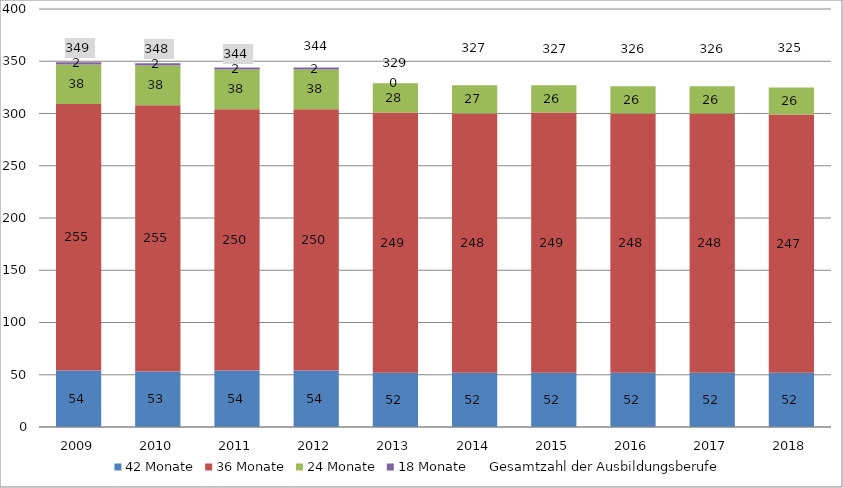
| Category | 42 Monate | 36 Monate | 24 Monate | 18 Monate |
|---|---|---|---|---|
| 2009.0 | 54 | 255 | 38 | 2 |
| 2010.0 | 53 | 255 | 38 | 2 |
| 2011.0 | 54 | 250 | 38 | 2 |
| 2012.0 | 54 | 250 | 38 | 2 |
| 2013.0 | 52 | 249 | 28 | 0 |
| 2014.0 | 52 | 248 | 27 | 0 |
| 2015.0 | 52 | 249 | 26 | 0 |
| 2016.0 | 52 | 248 | 26 | 0 |
| 2017.0 | 52 | 248 | 26 | 0 |
| 2018.0 | 52 | 247 | 26 | 0 |